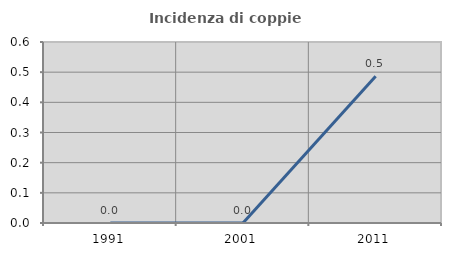
| Category | Incidenza di coppie miste |
|---|---|
| 1991.0 | 0 |
| 2001.0 | 0 |
| 2011.0 | 0.486 |